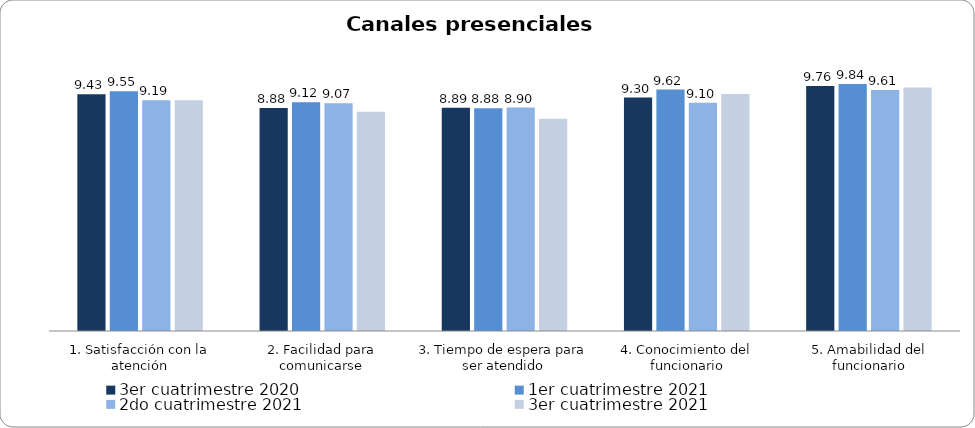
| Category | 3er cuatrimestre 2020 | Septiembre - Octubre 2018 | 1er cuatrimestre 2021 | Noviembre - Diciembre 2018 | 1er cuatrimestre 2019 | 2do cuatrimestre 2019 | 2do cuatrimestre 2021 | 3er cuatrimestre 2021 |
|---|---|---|---|---|---|---|---|---|
| 1. Satisfacción con la atención | 9.433 |  | 9.547 |  |  |  | 9.191 | 9.192 |
| 2. Facilidad para comunicarse | 8.885 |  | 9.117 |  |  |  | 9.074 | 8.731 |
| 3. Tiempo de espera para ser atendido | 8.894 |  | 8.876 |  |  |  | 8.904 | 8.452 |
| 4. Conocimiento del funcionario | 9.298 |  | 9.62 |  |  |  | 9.096 | 9.442 |
| 5. Amabilidad del funcionario | 9.76 |  | 9.839 |  |  |  | 9.606 | 9.702 |